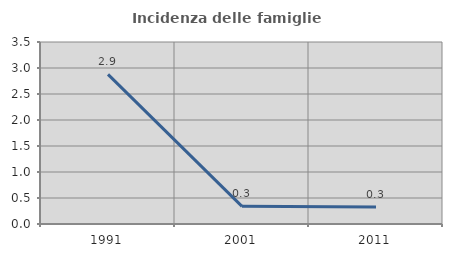
| Category | Incidenza delle famiglie numerose |
|---|---|
| 1991.0 | 2.878 |
| 2001.0 | 0.339 |
| 2011.0 | 0.325 |